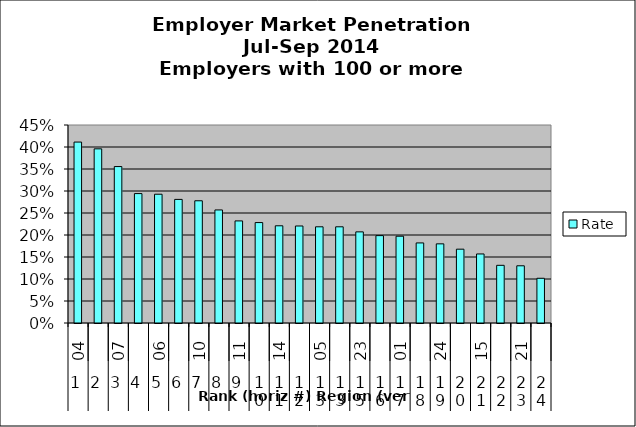
| Category | Rate |
|---|---|
| 0 | 0.411 |
| 1 | 0.396 |
| 2 | 0.356 |
| 3 | 0.294 |
| 4 | 0.293 |
| 5 | 0.281 |
| 6 | 0.278 |
| 7 | 0.257 |
| 8 | 0.232 |
| 9 | 0.228 |
| 10 | 0.221 |
| 11 | 0.22 |
| 12 | 0.219 |
| 13 | 0.219 |
| 14 | 0.207 |
| 15 | 0.199 |
| 16 | 0.197 |
| 17 | 0.182 |
| 18 | 0.18 |
| 19 | 0.168 |
| 20 | 0.157 |
| 21 | 0.131 |
| 22 | 0.13 |
| 23 | 0.102 |